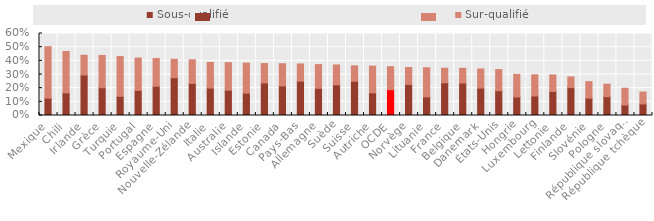
| Category | Sous-qualifié | Sur-qualifié |
|---|---|---|
| Mexique | 0.127 | 0.377 |
| Chili | 0.165 | 0.303 |
| Irlande | 0.296 | 0.145 |
| Grèce | 0.203 | 0.236 |
| Turquie | 0.14 | 0.291 |
| Portugal | 0.183 | 0.237 |
| Espagne | 0.214 | 0.204 |
| Royaume-Uni | 0.276 | 0.135 |
| Nouvelle-Zélande | 0.235 | 0.173 |
| Italie | 0.201 | 0.188 |
| Australie | 0.185 | 0.202 |
| Islande | 0.164 | 0.219 |
| Estonie | 0.239 | 0.141 |
| Canada | 0.217 | 0.162 |
| Pays-Bas | 0.251 | 0.126 |
| Allemagne | 0.199 | 0.173 |
| Suède | 0.224 | 0.146 |
| Suisse | 0.25 | 0.113 |
| Autriche | 0.166 | 0.196 |
| OCDE | 0.189 | 0.168 |
| Norvège | 0.227 | 0.124 |
| Lituanie | 0.136 | 0.213 |
| France | 0.239 | 0.106 |
| Belgique | 0.238 | 0.107 |
| Danemark | 0.201 | 0.14 |
| États-Unis | 0.181 | 0.155 |
| Hongrie | 0.136 | 0.165 |
| Luxembourg | 0.143 | 0.155 |
| Lettonie | 0.176 | 0.121 |
| Finlande | 0.204 | 0.078 |
| Slovénie | 0.127 | 0.12 |
| Pologne | 0.138 | 0.092 |
| République slovaque | 0.077 | 0.123 |
| République tchèque | 0.085 | 0.087 |